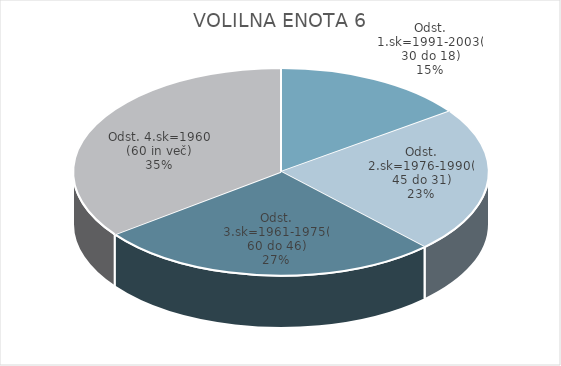
| Category | VOLILNA ENOTA 6 |
|---|---|
| Odst. 1.sk=1991-2003(30 do 18) | 6.78 |
| Odst. 2.sk=1976-1990(45 do 31) | 10.24 |
| Odst. 3.sk=1961-1975(60 do 46) | 12.06 |
| Odst. 4.sk=1960 (60 in več) | 15.85 |